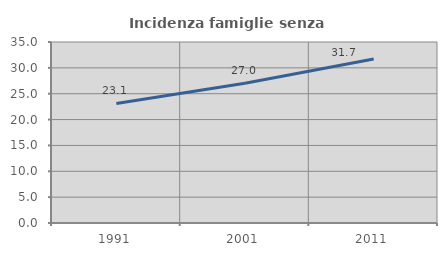
| Category | Incidenza famiglie senza nuclei |
|---|---|
| 1991.0 | 23.112 |
| 2001.0 | 27.04 |
| 2011.0 | 31.694 |